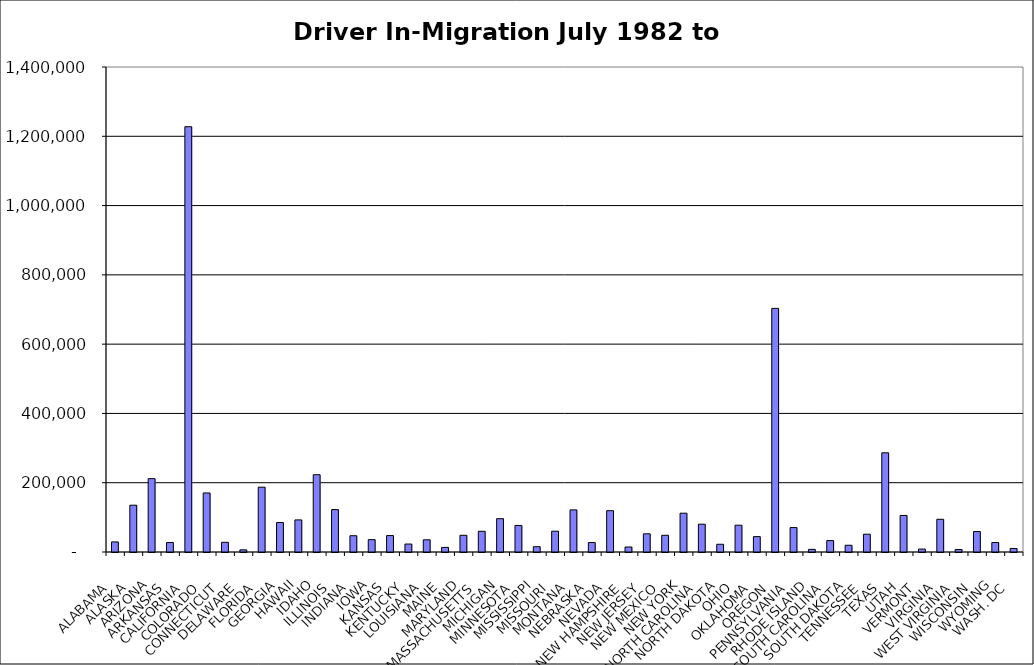
| Category | Series 0 |
|---|---|
|  ALABAMA  | 29072.5 |
|  ALASKA  | 135060.5 |
|  ARIZONA  | 211767 |
|  ARKANSAS  | 27330.5 |
|  CALIFORNIA  | 1227643.5 |
|  COLORADO  | 170403 |
|  CONNECTICUT  | 27921 |
|  DELAWARE  | 6212.5 |
|  FLORIDA  | 187114 |
|  GEORGIA  | 85033 |
|  HAWAII  | 92614.5 |
|  IDAHO  | 223047.5 |
|  ILLINOIS  | 122436.5 |
|  INDIANA  | 46990 |
|  IOWA  | 35635.5 |
|  KANSAS  | 47427.5 |
|  KENTUCKY  | 22990 |
|  LOUISIANA  | 35215.5 |
|  MAINE  | 13265.5 |
|  MARYLAND  | 48286 |
|  MASSACHUSETTS  | 59721 |
|  MICHIGAN  | 96245 |
|  MINNESOTA  | 76706.5 |
|  MISSISSIPPI  | 15304 |
|  MISSOURI  | 60033 |
|  MONTANA  | 121575 |
|  NEBRASKA  | 27279.5 |
|  NEVADA  | 119258 |
|  NEW HAMPSHIRE  | 14434.5 |
|  NEW JERSEY  | 52485 |
|  NEW MEXICO  | 48256 |
|  NEW YORK  | 112030 |
|  NORTH CAROLINA  | 80276.5 |
|  NORTH DAKOTA  | 22292.5 |
|  OHIO  | 77377.5 |
|  OKLAHOMA  | 44410 |
|  OREGON  | 703211 |
|  PENNSYLVANIA  | 70490.5 |
|  RHODE ISLAND  | 7601 |
|  SOUTH CAROLINA  | 32882.5 |
|  SOUTH DAKOTA  | 19444.5 |
|  TENNESSEE  | 51352.5 |
|  TEXAS  | 286251 |
|  UTAH  | 105500.5 |
|  VERMONT  | 8496 |
|  VIRGINIA  | 94425 |
|  WEST VIRGINIA  | 7154.5 |
|  WISCONSIN  | 59033.5 |
|  WYOMING  | 27345 |
|  WASH. DC  | 10151 |